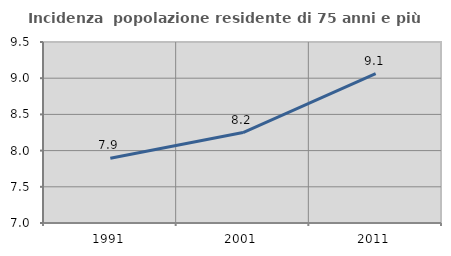
| Category | Incidenza  popolazione residente di 75 anni e più |
|---|---|
| 1991.0 | 7.895 |
| 2001.0 | 8.249 |
| 2011.0 | 9.063 |